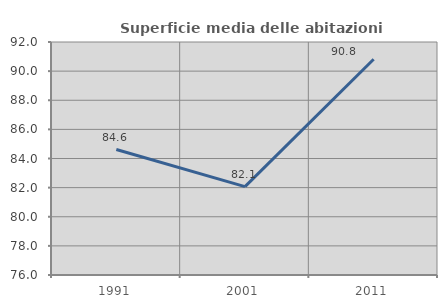
| Category | Superficie media delle abitazioni occupate |
|---|---|
| 1991.0 | 84.618 |
| 2001.0 | 82.065 |
| 2011.0 | 90.816 |